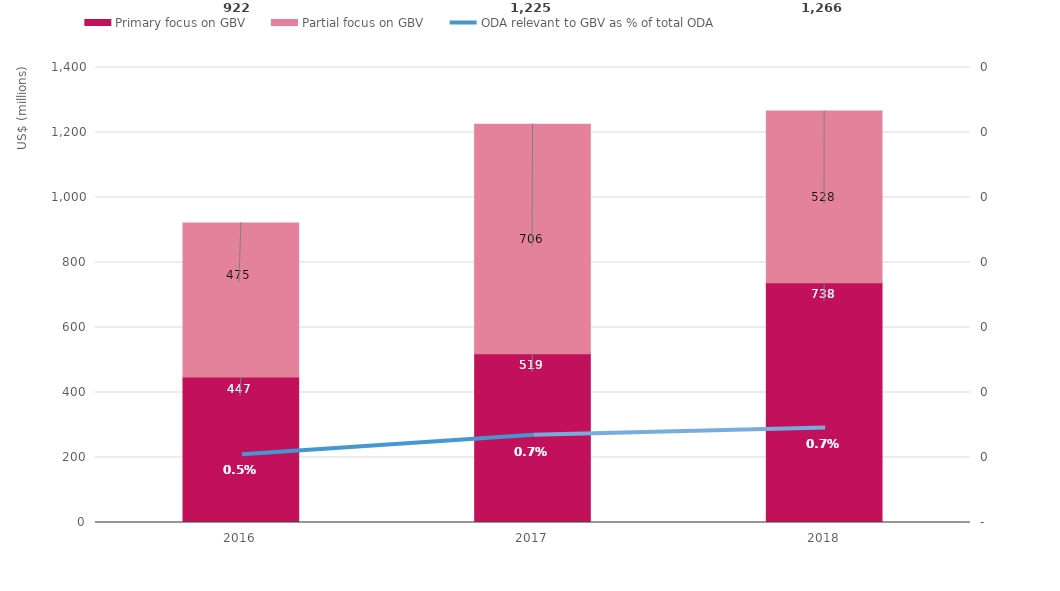
| Category | Primary focus on GBV | Partial focus on GBV |
|---|---|---|
| 2016.0 | 447.37 | 474.53 |
| 2017.0 | 518.952 | 706.423 |
| 2018.0 | 738.02 | 528.142 |